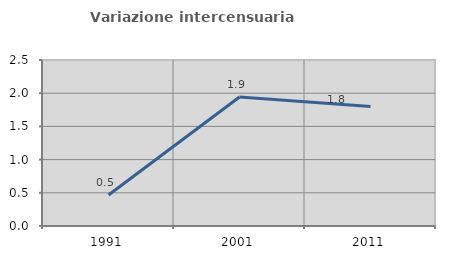
| Category | Variazione intercensuaria annua |
|---|---|
| 1991.0 | 0.466 |
| 2001.0 | 1.944 |
| 2011.0 | 1.801 |